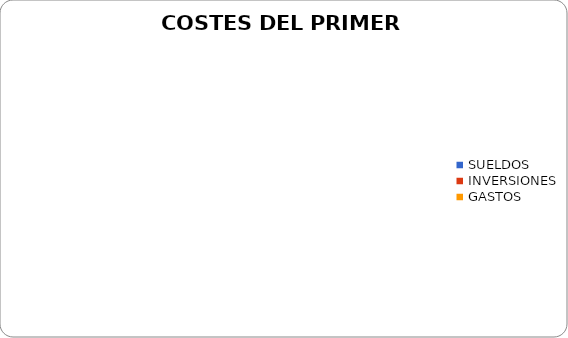
| Category | Series 0 |
|---|---|
| SUELDOS | 0 |
| INVERSIONES | 0 |
| GASTOS | 0 |